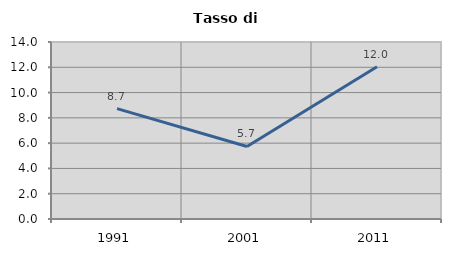
| Category | Tasso di disoccupazione   |
|---|---|
| 1991.0 | 8.727 |
| 2001.0 | 5.735 |
| 2011.0 | 12.04 |